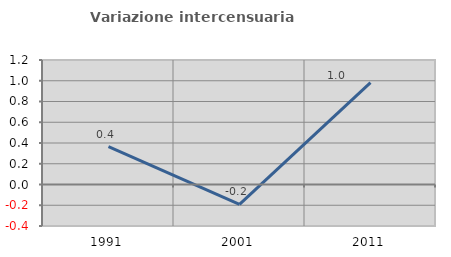
| Category | Variazione intercensuaria annua |
|---|---|
| 1991.0 | 0.365 |
| 2001.0 | -0.192 |
| 2011.0 | 0.983 |